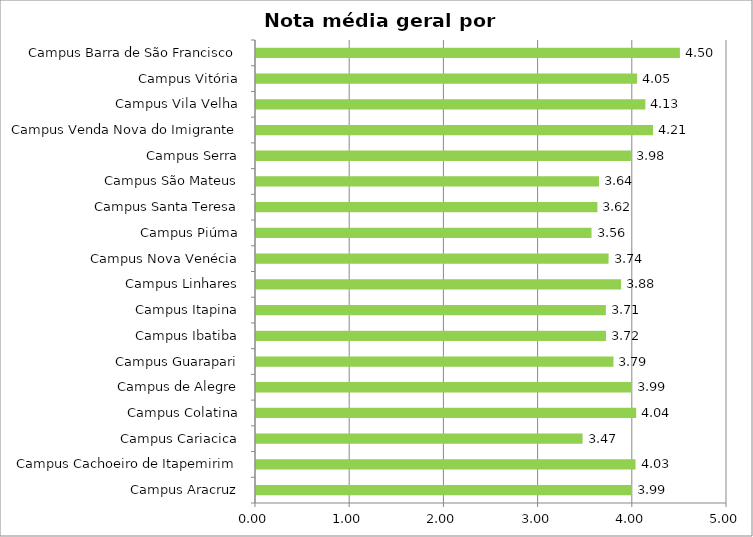
| Category | Series 0 |
|---|---|
| Campus Aracruz | 3.991 |
| Campus Cachoeiro de Itapemirim | 4.029 |
| Campus Cariacica | 3.467 |
| Campus Colatina | 4.036 |
| Campus de Alegre | 3.989 |
| Campus Guarapari | 3.795 |
| Campus Ibatiba | 3.715 |
| Campus Itapina | 3.714 |
| Campus Linhares | 3.876 |
| Campus Nova Venécia | 3.743 |
| Campus Piúma | 3.562 |
| Campus Santa Teresa | 3.624 |
| Campus São Mateus | 3.641 |
| Campus Serra | 3.98 |
| Campus Venda Nova do Imigrante | 4.215 |
| Campus Vila Velha | 4.134 |
| Campus Vitória | 4.046 |
| Campus Barra de São Francisco | 4.5 |